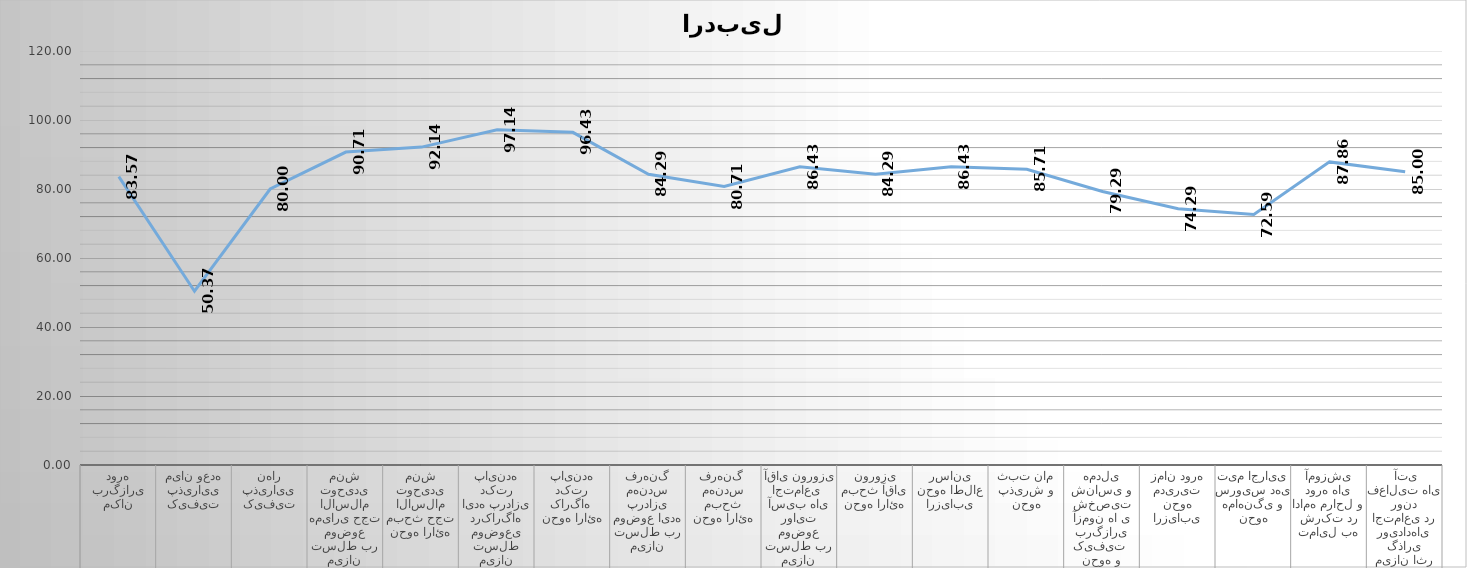
| Category | Series 0 |
|---|---|
| مکان برگزاری دوره | 83.571 |
| کیفیت پذیرایی میان وعده | 50.37 |
| کیفیت پذیرایی نهار | 80 |
| میزان تسلط بر موضوع همیاری حجت الاسلام توحیدی منش | 90.714 |
| نحوه ارائه مبحث حجت الاسلام توحیدی منش | 92.143 |
| میزان تسلط موضوعی درکارگاه ایده پردازی دکتر پاینده | 97.143 |
| نحوه ارائه کارگاه  دکتر پاینده | 96.429 |
| میزان تسلط بر موضوع ایده پردازی مهندس فرهنگ | 84.286 |
| نحوه ارائه مبحث مهندس فرهنگ  | 80.714 |
| میزان تسلط بر موضوع روایت آسیب های اجتماعی  آقای نوروزی | 86.429 |
| نحوه ارائه مبحث آقای نوروزی | 84.286 |
| ارزیابی نحوه اطلاع رسانی | 86.429 |
| نحوه پذیرش و ثبت نام | 85.714 |
| ارزیابی نحوه و کیفیت  برگزاری آزمون ها ی شخصیت شناسی و همدلی | 79.286 |
| ارزیابی نحوه مدیریت زمان دوره | 74.286 |
| نحوه هماهنگی و سرویس دهی تیم اجرایی | 72.593 |
| تمایل به شرکت در ادامه مراحل و دوره های آموزشی | 87.857 |
| میزان اثر گذاری رویدادهای اجتماعی در روند فعالیت های  آتی | 85 |